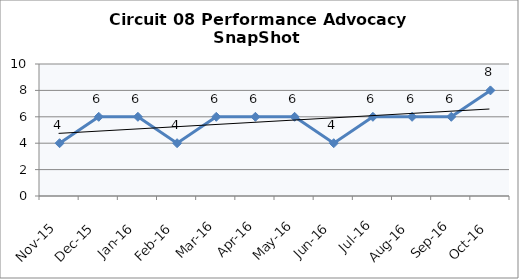
| Category | Circuit 08 |
|---|---|
| Nov-15 | 4 |
| Dec-15 | 6 |
| Jan-16 | 6 |
| Feb-16 | 4 |
| Mar-16 | 6 |
| Apr-16 | 6 |
| May-16 | 6 |
| Jun-16 | 4 |
| Jul-16 | 6 |
| Aug-16 | 6 |
| Sep-16 | 6 |
| Oct-16 | 8 |